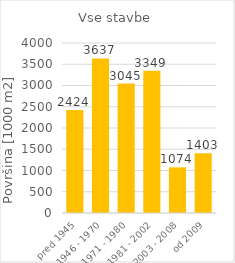
| Category | Series 0 |
|---|---|
| pred 1945 | 2424226.2 |
| 1946 - 1970 | 3637164.4 |
| 1971 - 1980 | 3044999.3 |
| 1981 - 2002 | 3348863.2 |
| 2003 - 2008 | 1074447.4 |
| od 2009 | 1403032.1 |